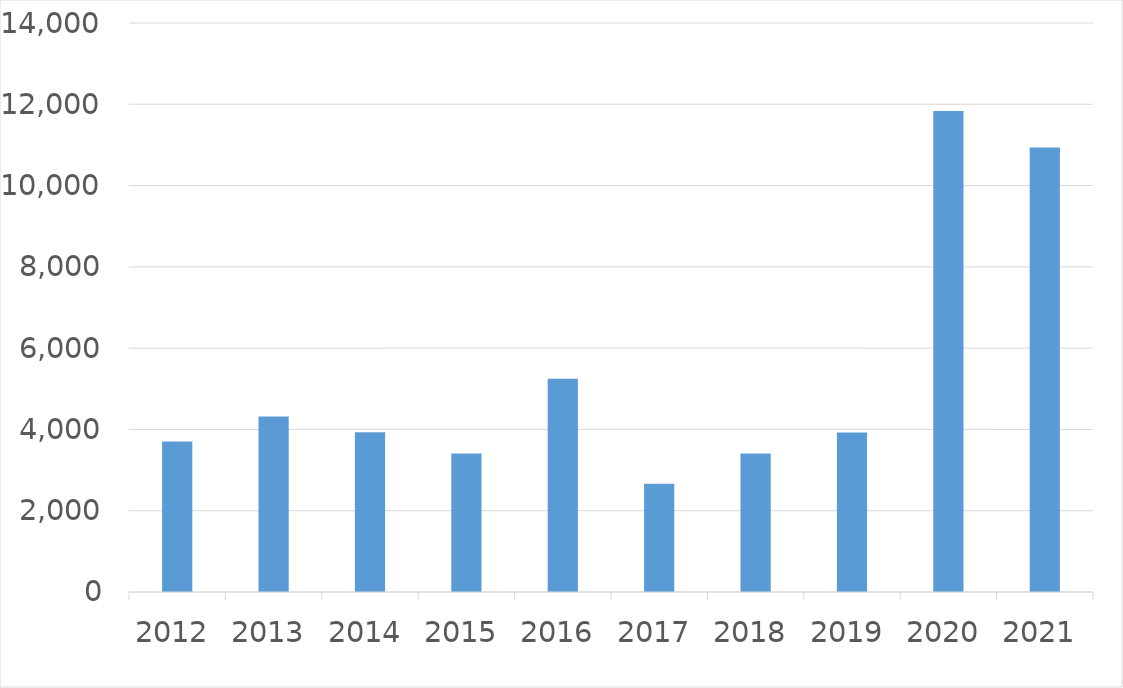
| Category | Series 0 |
|---|---|
| 2012 | 3706 |
| 2013 | 4321 |
| 2014 | 3928 |
| 2015 | 3405 |
| 2016 | 5249 |
| 2017 | 2664 |
| 2018 | 3410 |
| 2019 | 3923 |
| 2020 | 11835 |
| 2021 | 10937 |